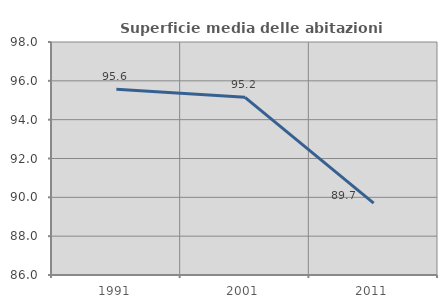
| Category | Superficie media delle abitazioni occupate |
|---|---|
| 1991.0 | 95.571 |
| 2001.0 | 95.153 |
| 2011.0 | 89.705 |